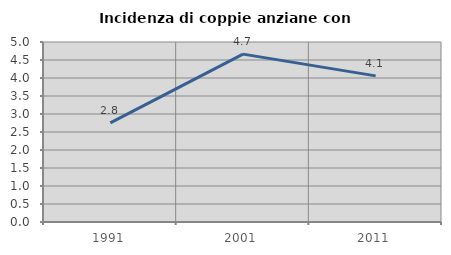
| Category | Incidenza di coppie anziane con figli |
|---|---|
| 1991.0 | 2.752 |
| 2001.0 | 4.663 |
| 2011.0 | 4.059 |